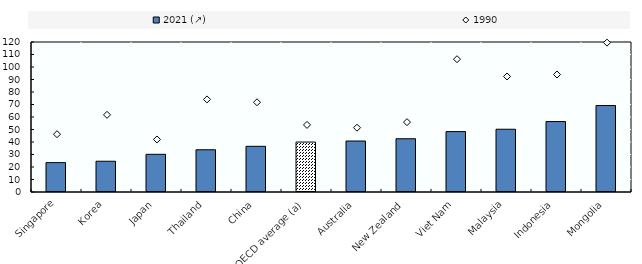
| Category | 2021 (↗) |
|---|---|
| Singapore | 23.494 |
| Korea | 24.611 |
| Japan | 30.161 |
| Thailand | 33.79 |
| China | 36.544 |
| OECD average (a) | 39.953 |
| Australia | 40.778 |
| New Zealand | 42.596 |
| Viet Nam | 48.315 |
| Malaysia | 50.201 |
| Indonesia | 56.339 |
| Mongolia | 69.171 |